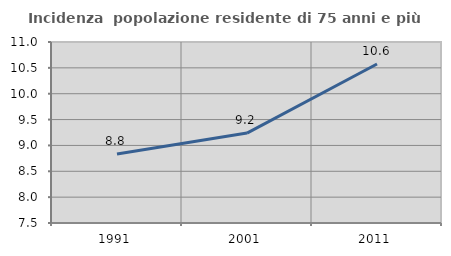
| Category | Incidenza  popolazione residente di 75 anni e più |
|---|---|
| 1991.0 | 8.834 |
| 2001.0 | 9.239 |
| 2011.0 | 10.576 |